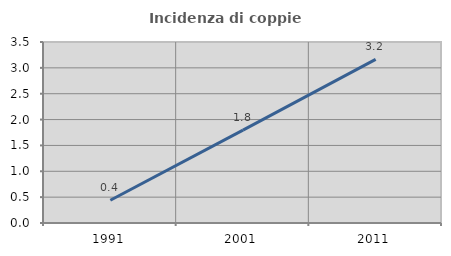
| Category | Incidenza di coppie miste |
|---|---|
| 1991.0 | 0.44 |
| 2001.0 | 1.796 |
| 2011.0 | 3.165 |